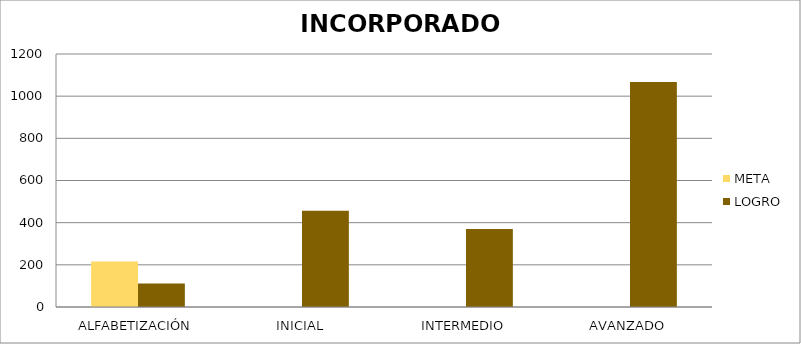
| Category | META | LOGRO |
|---|---|---|
| ALFABETIZACIÓN | 216 | 112 |
| INICIAL | 0 | 456 |
| INTERMEDIO | 0 | 370 |
| AVANZADO | 0 | 1067 |